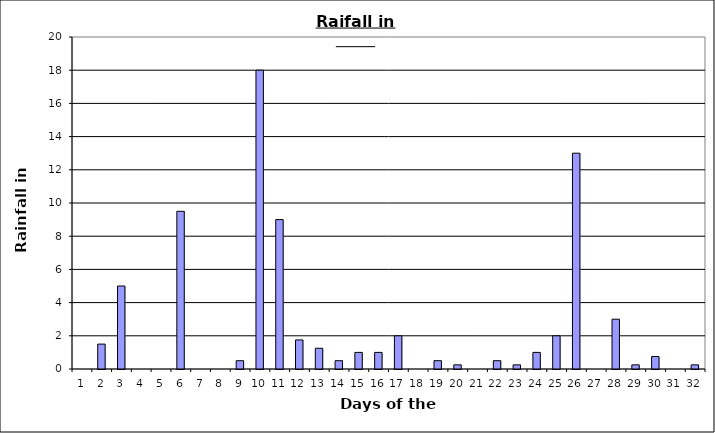
| Category | Series 0 |
|---|---|
| 0 | 0 |
| 1 | 1.5 |
| 2 | 5 |
| 3 | 0 |
| 4 | 0 |
| 5 | 9.5 |
| 6 | 0 |
| 7 | 0 |
| 8 | 0.5 |
| 9 | 18 |
| 10 | 9 |
| 11 | 1.75 |
| 12 | 1.25 |
| 13 | 0.5 |
| 14 | 1 |
| 15 | 1 |
| 16 | 2 |
| 17 | 0 |
| 18 | 0.5 |
| 19 | 0.25 |
| 20 | 0 |
| 21 | 0.5 |
| 22 | 0.25 |
| 23 | 1 |
| 24 | 2 |
| 25 | 13 |
| 26 | 0 |
| 27 | 3 |
| 28 | 0.25 |
| 29 | 0.75 |
| 30 | 0 |
| 31 | 0.25 |